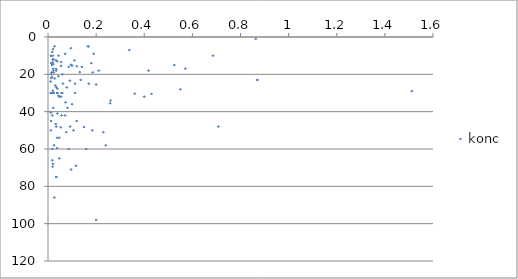
| Category | konc |
|---|---|
| 0.43 | 30.5 |
| 0.36 | 30.4 |
| 0.033 | 12.5 |
| 0.044 | 31.5 |
| 0.1 | 36 |
| 0.018 | 42 |
| 0.022 | 18 |
| 0.012 | 50 |
| 0.167 | 5 |
| 0.167 | 5 |
| 0.096 | 14.9 |
| 0.024 | 30 |
| 0.039 | 27.7 |
| 0.039 | 41 |
| 0.034 | 48 |
| 0.086 | 16 |
| 0.686 | 10 |
| 0.258 | 35.5 |
| 0.1 | 15.4 |
| 0.12 | 15.7 |
| 0.112 | 25 |
| 0.028 | 22.2 |
| 0.038 | 30 |
| 0.044 | 10 |
| 0.017 | 21.5 |
| 0.039 | 30 |
| 0.039 | 30 |
| 0.02 | 30 |
| 0.057 | 30 |
| 0.057 | 30 |
| 0.092 | 48 |
| 0.012 | 40.5 |
| 0.047 | 65 |
| 0.013 | 22 |
| 0.418 | 18 |
| 0.26 | 34 |
| 0.02 | 28.8 |
| 0.011 | 30 |
| 0.113 | 30 |
| 0.159 | 60 |
| 0.019 | 69.5 |
| 0.013 | 45 |
| 0.062 | 25 |
| 0.015 | 19 |
| 0.013 | 14 |
| 0.047 | 54 |
| 0.054 | 15.5 |
| 0.038 | 54 |
| 0.019 | 12 |
| 0.2 | 25.5 |
| 0.056 | 42 |
| 0.071 | 42 |
| 0.87 | 23 |
| 0.87 | 23 |
| 0.571 | 17 |
| 0.4 | 32 |
| 1.512 | 29 |
| 0.091 | 23.4 |
| 0.022 | 14.5 |
| 0.525 | 15 |
| 0.011 | 23.8 |
| 0.026 | 86 |
| 0.014 | 30 |
| 0.17 | 25 |
| 0.095 | 6 |
| 0.55 | 28 |
| 0.021 | 6.5 |
| 0.018 | 8 |
| 0.086 | 60 |
| 0.06 | 20 |
| 0.24 | 58 |
| 0.119 | 45 |
| 0.039 | 13 |
| 0.046 | 32 |
| 0.013 | 20 |
| 0.059 | 30 |
| 0.059 | 30 |
| 0.027 | 5 |
| 0.034 | 75 |
| 0.018 | 60 |
| 0.025 | 58 |
| 0.038 | 59.5 |
| 0.15 | 48.25 |
| 0.035 | 27 |
| 0.081 | 38 |
| 0.18 | 14 |
| 0.012 | 10.1 |
| 0.023 | 12 |
| 0.017 | 15 |
| 0.078 | 27 |
| 0.055 | 13.4 |
| 0.034 | 17.1 |
| 0.03 | 26 |
| 0.211 | 18 |
| 0.863 | 1 |
| 0.11 | 12.5 |
| 0.034 | 18 |
| 0.043 | 21 |
| 0.071 | 9 |
| 0.19 | 9 |
| 0.02 | 10 |
| 0.076 | 51 |
| 0.035 | 75 |
| 0.073 | 35 |
| 0.23 | 51 |
| 0.024 | 19 |
| 0.106 | 50 |
| 0.116 | 69 |
| 0.184 | 50 |
| 0.054 | 32 |
| 0.338 | 7 |
| 0.186 | 19 |
| 0.018 | 66 |
| 0.022 | 38 |
| 0.708 | 48 |
| 0.141 | 16 |
| 0.032 | 46.62 |
| 0.019 | 13.5 |
| 0.132 | 18.8 |
| 0.096 | 71 |
| 0.021 | 68 |
| 0.022 | 17 |
| 0.136 | 23 |
| 0.053 | 48.4 |
| 0.2 | 98 |